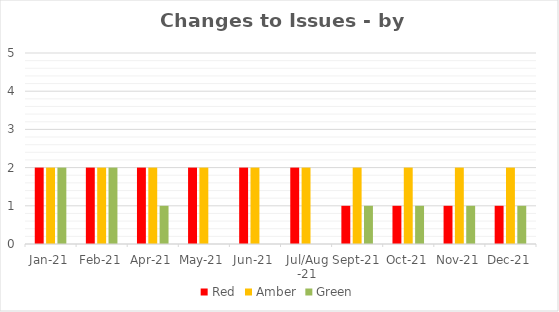
| Category | Red | Amber | Green |
|---|---|---|---|
| Jan-21 | 2 | 2 | 2 |
| Feb-21 | 2 | 2 | 2 |
| Apr-21 | 2 | 2 | 1 |
| May-21 | 2 | 2 | 0 |
| Jun-21 | 2 | 2 | 0 |
| Jul/Aug -21 | 2 | 2 | 0 |
| Sep-21 | 1 | 2 | 1 |
| Oct-21 | 1 | 2 | 1 |
| Nov-21 | 1 | 2 | 1 |
| Dec-21 | 1 | 2 | 1 |